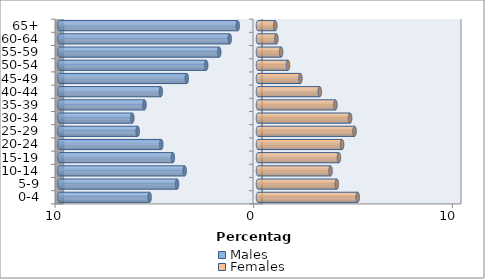
| Category | Males | Females |
|---|---|---|
| 0-4 | -5.455 | 5.018 |
| 5-9 | -4.074 | 3.969 |
| 10-14 | -3.69 | 3.653 |
| 15-19 | -4.286 | 4.073 |
| 20-24 | -4.869 | 4.233 |
| 25-29 | -6.055 | 4.861 |
| 30-34 | -6.326 | 4.635 |
| 35-39 | -5.715 | 3.896 |
| 40-44 | -4.892 | 3.109 |
| 45-49 | -3.586 | 2.137 |
| 50-54 | -2.608 | 1.51 |
| 55-59 | -1.949 | 1.164 |
| 60-64 | -1.423 | 0.925 |
| 65+ | -1.019 | 0.87 |